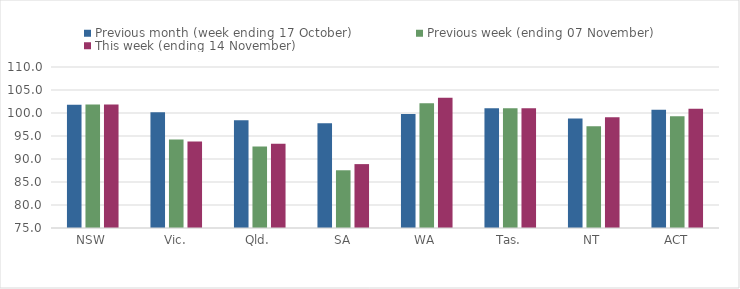
| Category | Previous month (week ending 17 October) | Previous week (ending 07 November) | This week (ending 14 November) |
|---|---|---|---|
| NSW | 101.8 | 101.84 | 101.84 |
| Vic. | 100.15 | 94.25 | 93.82 |
| Qld. | 98.4 | 92.73 | 93.34 |
| SA | 97.76 | 87.55 | 88.89 |
| WA | 99.77 | 102.1 | 103.3 |
| Tas. | 101.01 | 101.01 | 101.01 |
| NT | 98.8 | 97.11 | 99.05 |
| ACT | 100.7 | 99.3 | 100.92 |